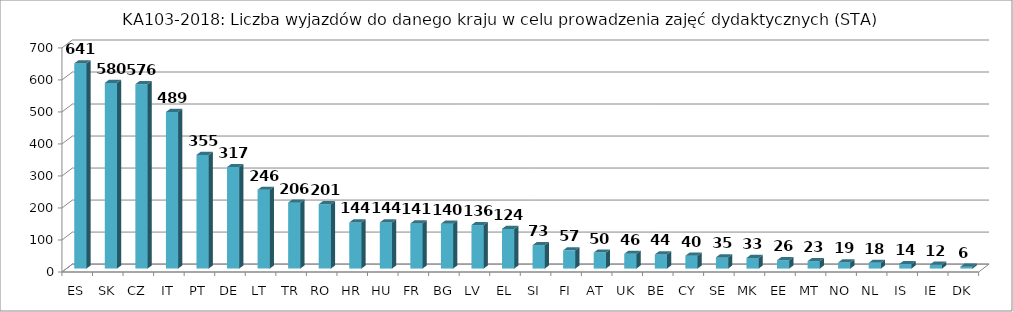
| Category | Liczba wyjazdów w celu prowadzenia zajęć (STA) |
|---|---|
| ES | 641 |
| SK | 580 |
| CZ | 576 |
| IT | 489 |
| PT | 355 |
| DE | 317 |
| LT | 246 |
| TR | 206 |
| RO | 201 |
| HR | 144 |
| HU | 144 |
| FR | 141 |
| BG | 140 |
| LV | 136 |
| EL | 124 |
| SI | 73 |
| FI | 57 |
| AT | 50 |
| UK | 46 |
| BE | 44 |
| CY | 40 |
| SE | 35 |
| MK | 33 |
| EE | 26 |
| MT | 23 |
| NO | 19 |
| NL | 18 |
| IS | 14 |
| IE | 12 |
| DK | 6 |